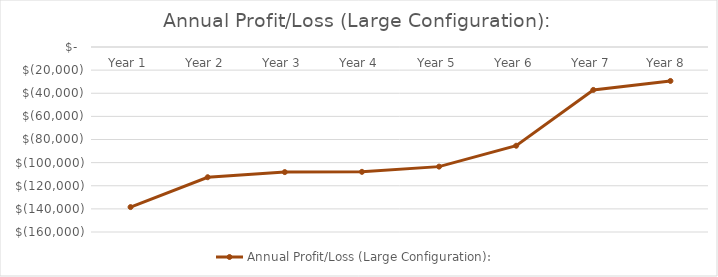
| Category | Annual Profit/Loss (Large Configuration):  |
|---|---|
| Year 1 | -138442.96 |
| Year 2 | -112630.96 |
| Year 3 | -108189.806 |
| Year 4 | -107972.652 |
| Year 5 | -103461.344 |
| Year 6 | -85393.872 |
| Year 7 | -37122.783 |
| Year 8  | -29371.783 |